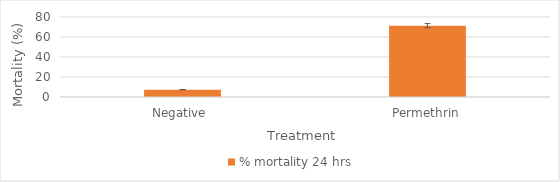
| Category | % mortality 24 hrs |
|---|---|
| Negative  | 7.273 |
| Permethrin | 71.296 |